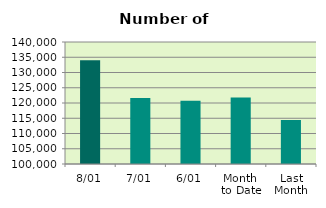
| Category | Series 0 |
|---|---|
| 8/01 | 134038 |
| 7/01 | 121618 |
| 6/01 | 120738 |
| Month 
to Date | 121803.2 |
| Last
Month | 114459.3 |